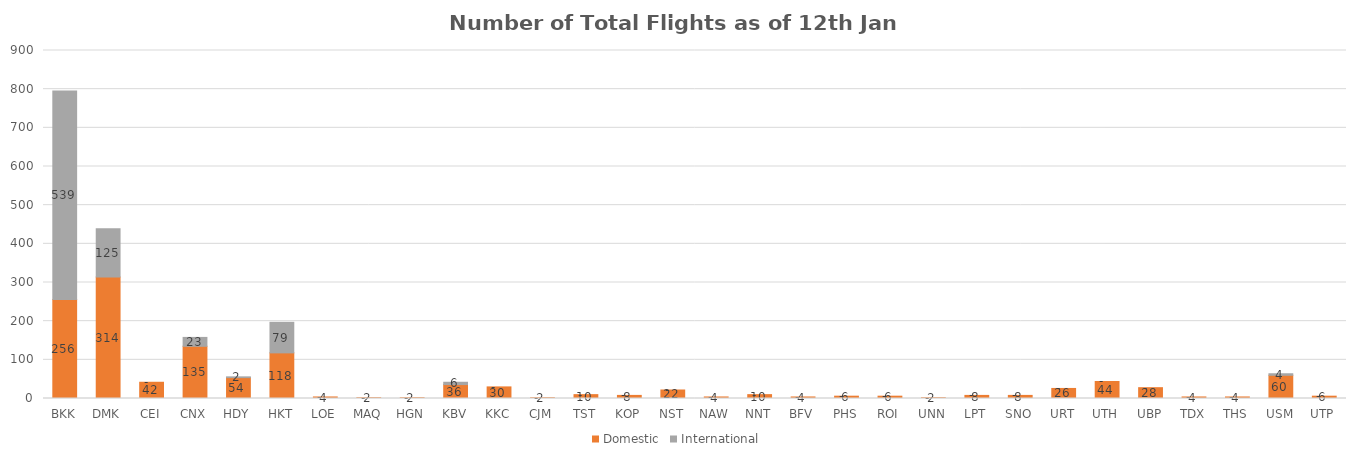
| Category | Domestic | International |
|---|---|---|
| BKK | 256 | 539 |
| DMK | 314 | 125 |
| CEI | 42 | 0 |
| CNX | 135 | 23 |
| HDY | 54 | 2 |
| HKT | 118 | 79 |
| LOE | 4 | 0 |
| MAQ | 2 | 0 |
| HGN | 2 | 0 |
| KBV | 36 | 6 |
| KKC | 30 | 0 |
| CJM | 2 | 0 |
| TST | 10 | 0 |
| KOP | 8 | 0 |
| NST | 22 | 0 |
| NAW | 4 | 0 |
| NNT | 10 | 0 |
| BFV | 4 | 0 |
| PHS | 6 | 0 |
| ROI | 6 | 0 |
| UNN | 2 | 0 |
| LPT | 8 | 0 |
| SNO | 8 | 0 |
| URT | 26 | 0 |
| UTH | 44 | 0 |
| UBP | 28 | 0 |
| TDX | 4 | 0 |
| THS | 4 | 0 |
| USM | 60 | 4 |
| UTP | 6 | 0 |